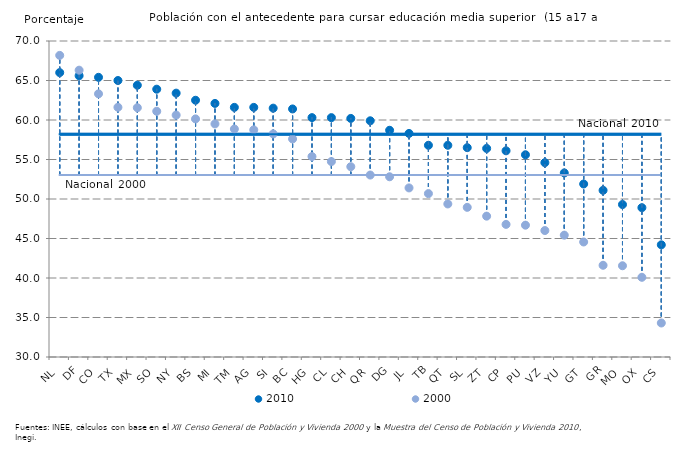
| Category | Series 3 | Series 4 | 2010 | Series 0 | Series 1 | 2000 |
|---|---|---|---|---|---|---|
| NL | 58.2 | 58.2 | 66 | 53.028 | 53.028 | 68.18 |
| DF | 58.2 | 58.2 | 65.6 | 53.028 | 53.028 | 66.306 |
| CO | 58.2 | 58.2 | 65.4 | 53.028 | 53.028 | 63.315 |
| TX | 58.2 | 58.2 | 65 | 53.028 | 53.028 | 61.614 |
| MX | 58.2 | 58.2 | 64.4 | 53.028 | 53.028 | 61.556 |
| SO | 58.2 | 58.2 | 63.9 | 53.028 | 53.028 | 61.105 |
| NY | 58.2 | 58.2 | 63.4 | 53.028 | 53.028 | 60.624 |
| BS | 58.2 | 58.2 | 62.5 | 53.028 | 53.028 | 60.142 |
| MI | 58.2 | 58.2 | 62.1 | 53.028 | 53.028 | 59.505 |
| TM | 58.2 | 58.2 | 61.6 | 53.028 | 53.028 | 58.862 |
| AG | 58.2 | 58.2 | 61.6 | 53.028 | 53.028 | 58.753 |
| SI | 58.2 | 58.2 | 61.5 | 53.028 | 53.028 | 58.24 |
| BC | 58.2 | 58.2 | 61.4 | 53.028 | 53.028 | 57.606 |
| HG | 58.2 | 58.2 | 60.3 | 53.028 | 53.028 | 55.373 |
| CL | 58.2 | 58.2 | 60.3 | 53.028 | 53.028 | 54.739 |
| CH | 58.2 | 58.2 | 60.2 | 53.028 | 53.028 | 54.089 |
| QR | 58.2 | 58.2 | 59.9 | 53.028 | 53.028 | 53.033 |
| DG | 58.2 | 58.2 | 58.7 | 53.028 | 53.028 | 52.814 |
| JL | 58.2 | 58.2 | 58.3 | 53.028 | 53.028 | 51.404 |
| TB | 58.2 | 58.2 | 56.8 | 53.028 | 53.028 | 50.684 |
| QT | 58.2 | 58.2 | 56.8 | 53.028 | 53.028 | 49.375 |
| SL | 58.2 | 58.2 | 56.5 | 53.028 | 53.028 | 48.944 |
| ZT | 58.2 | 58.2 | 56.4 | 53.028 | 53.028 | 47.827 |
| CP | 58.2 | 58.2 | 56.1 | 53.028 | 53.028 | 46.789 |
| PU | 58.2 | 58.2 | 55.6 | 53.028 | 53.028 | 46.685 |
| VZ | 58.2 | 58.2 | 54.6 | 53.028 | 53.028 | 46.005 |
| YU | 58.2 | 58.2 | 53.3 | 53.028 | 53.028 | 45.423 |
| GT | 58.2 | 58.2 | 51.9 | 53.028 | 53.028 | 44.56 |
| GR | 58.2 | 58.2 | 51.1 | 53.028 | 53.028 | 41.612 |
| MO | 58.2 | 58.2 | 49.3 | 53.028 | 53.028 | 41.552 |
| OX | 58.2 | 58.2 | 48.9 | 53.028 | 53.028 | 40.09 |
| CS | 58.2 | 58.2 | 44.2 | 53.028 | 53.028 | 34.305 |